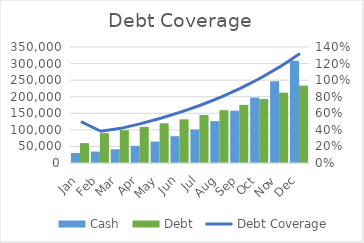
| Category | Cash | Debt |
|---|---|---|
| Jan | 30000 | 60000 |
| Feb | 34500 | 90000 |
| Mar | 41400 | 99000 |
| Apr | 51750 | 108900 |
| May | 64687.5 | 119790 |
| Jun | 80859.375 | 131769 |
| Jul | 101074.219 | 144945.9 |
| Aug | 126342.773 | 159440.49 |
| Sep | 157928.467 | 175384.539 |
| Oct | 197410.583 | 192922.993 |
| Nov | 246763.229 | 212215.292 |
| Dec | 308454.037 | 233436.821 |